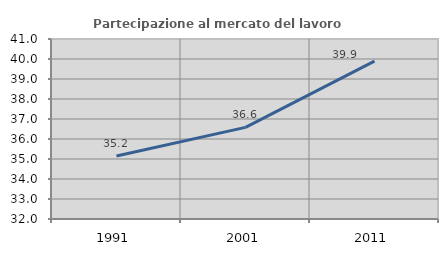
| Category | Partecipazione al mercato del lavoro  femminile |
|---|---|
| 1991.0 | 35.152 |
| 2001.0 | 36.582 |
| 2011.0 | 39.897 |